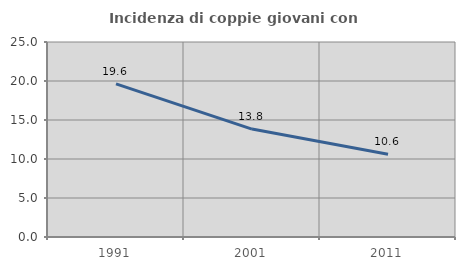
| Category | Incidenza di coppie giovani con figli |
|---|---|
| 1991.0 | 19.64 |
| 2001.0 | 13.837 |
| 2011.0 | 10.611 |